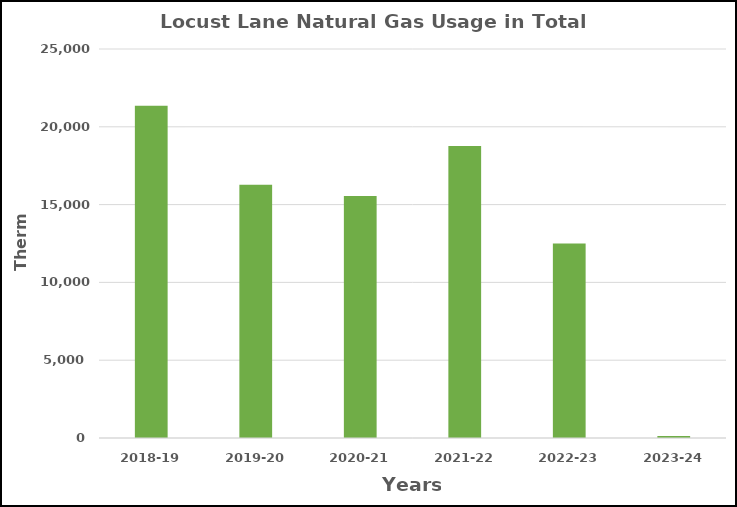
| Category | Series 0 |
|---|---|
| 2018-19 | 21350 |
| 2019-20 | 16273 |
| 2020-21 | 15545 |
| 2021-22 | 18769 |
| 2022-23 | 12495 |
| 2023-24 | 125 |